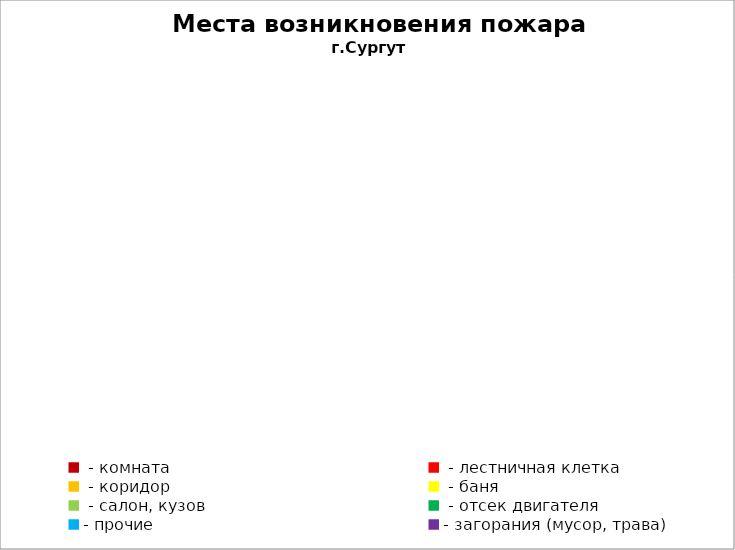
| Category | Места возникновения пожара |
|---|---|
|  - комната | 50 |
|  - лестничная клетка | 5 |
|  - коридор | 4 |
|  - баня | 23 |
|  - салон, кузов | 11 |
|  - отсек двигателя | 28 |
| - прочие | 72 |
| - загорания (мусор, трава)  | 104 |